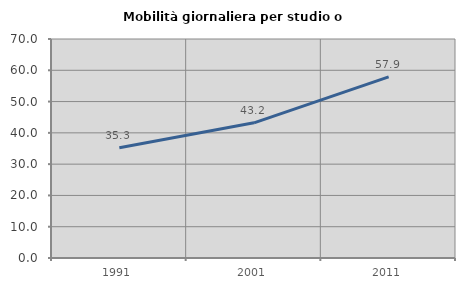
| Category | Mobilità giornaliera per studio o lavoro |
|---|---|
| 1991.0 | 35.268 |
| 2001.0 | 43.216 |
| 2011.0 | 57.895 |